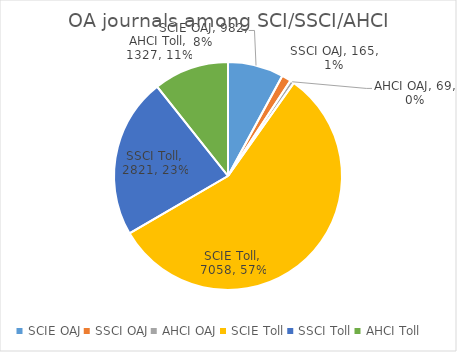
| Category | Series 0 |
|---|---|
| SCIE OAJ | 982 |
| SSCI OAJ | 165 |
| AHCI OAJ | 69 |
| SCIE Toll | 7058 |
| SSCI Toll | 2821 |
| AHCI Toll | 1327 |